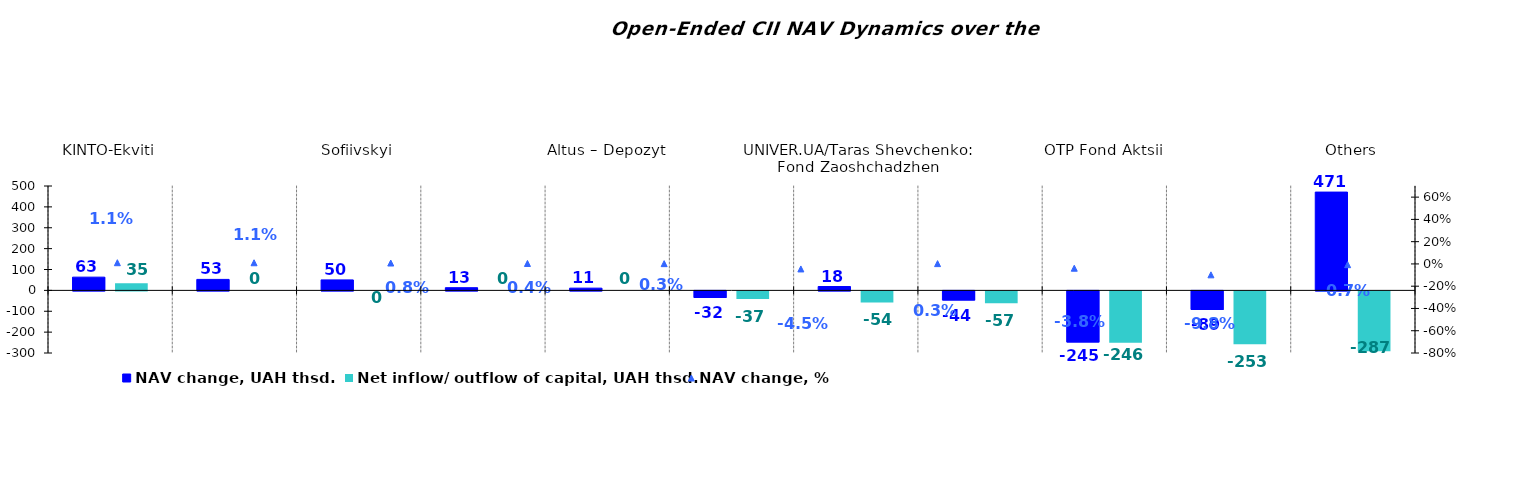
| Category | NAV change, UAH thsd. | Net inflow/ outflow of capital, UAH thsd. |
|---|---|---|
| KINTO-Ekviti | 63.369 | 34.716 |
| ОТP - Кlasychnyi | 52.611 | 0 |
| Sofiivskyi | 50.171 | 0 |
| Altus – Zbalansovanyi | 12.844 | 0 |
| Altus – Depozyt | 10.675 | 0 |
| UNIVER.UA/Myhailo Hrushevskyi: Fond Derzhavnykh Paperiv    | -31.779 | -36.522 |
| UNIVER.UA/Taras Shevchenko: Fond Zaoshchadzhen | 18.462 | -53.533 |
| KINTO-Kaznacheiskyi | -43.953 | -57.194 |
| ОТP Fond Aktsii | -244.831 | -245.571 |
| VSI | -89.131 | -253.466 |
| Others | 470.814 | -287.281 |